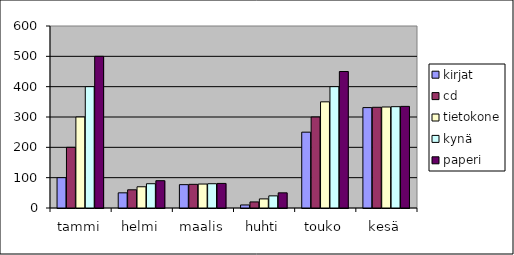
| Category | kirjat | cd | tietokone | kynä | paperi |
|---|---|---|---|---|---|
| tammi | 100 | 200 | 300 | 400 | 500 |
| helmi | 50 | 60 | 70 | 80 | 90 |
| maalis | 77 | 78 | 79 | 80 | 81 |
| huhti | 10 | 20 | 30 | 40 | 50 |
| touko | 250 | 300 | 350 | 400 | 450 |
| kesä | 331 | 332 | 333 | 334 | 335 |